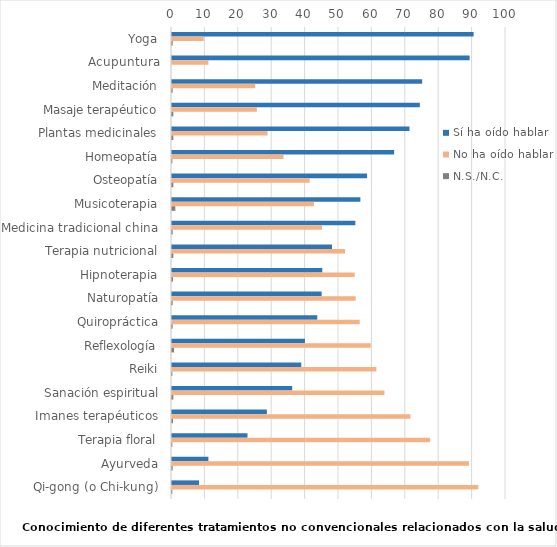
| Category | Sí ha oído hablar | No ha oído hablar | N.S./N.C. |
|---|---|---|---|
| Yoga | 90.3 | 9.5 | 0.2 |
| Acupuntura | 89.1 | 10.9 | 0 |
| Meditación | 74.9 | 24.9 | 0.2 |
| Masaje terapéutico | 74.2 | 25.4 | 0.4 |
| Plantas medicinales | 71.1 | 28.6 | 0.4 |
| Homeopatía | 66.5 | 33.4 | 0.1 |
| Osteopatía | 58.4 | 41.2 | 0.4 |
| Musicoterapia | 56.4 | 42.5 | 1 |
| Medicina tradicional china | 54.9 | 44.9 | 0.2 |
| Terapia nutricional | 47.9 | 51.8 | 0.4 |
| Hipnoterapia | 45 | 54.7 | 0.3 |
| Naturopatía | 44.8 | 55 | 0.2 |
| Quiropráctica | 43.5 | 56.2 | 0.2 |
| Reflexología | 39.8 | 59.5 | 0.6 |
| Reiki | 38.7 | 61.2 | 0.1 |
| Sanación espiritual | 36 | 63.6 | 0.4 |
| Imanes terapéuticos | 28.4 | 71.4 | 0.3 |
| Terapia floral | 22.6 | 77.3 | 0.1 |
| Ayurveda | 10.9 | 88.9 | 0.2 |
| Qi-gong (o Chi-kung) | 8.1 | 91.7 | 0.1 |